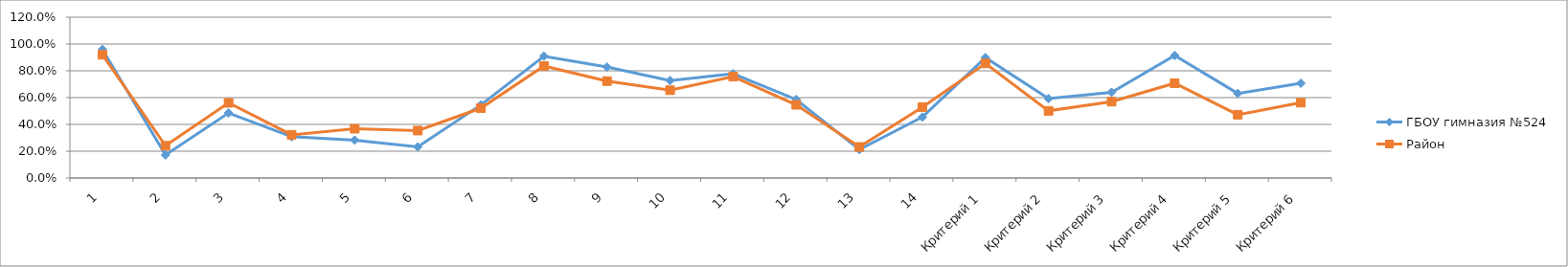
| Category | ГБОУ гимназия №524 | Район |
|---|---|---|
| 1 | 0.96 | 0.92 |
| 2 | 0.172 | 0.241 |
| 3 | 0.485 | 0.561 |
| 4 | 0.308 | 0.322 |
| 5 | 0.283 | 0.368 |
| 6 | 0.232 | 0.354 |
| 7 | 0.545 | 0.521 |
| 8 | 0.909 | 0.836 |
| 9 | 0.828 | 0.723 |
| 10 | 0.727 | 0.655 |
| 11 | 0.778 | 0.756 |
| 12 | 0.586 | 0.546 |
| 13 | 0.212 | 0.232 |
| 14 | 0.455 | 0.529 |
| Критерий 1 | 0.899 | 0.855 |
| Критерий 2 | 0.593 | 0.501 |
| Критерий 3 | 0.64 | 0.57 |
| Критерий 4 | 0.914 | 0.707 |
| Критерий 5 | 0.631 | 0.472 |
| Критерий 6 | 0.707 | 0.562 |